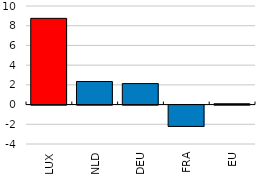
| Category | Series 0 |
|---|---|
| LUX | 8.747 |
| NLD | 2.341 |
| DEU | 2.128 |
| FRA | -2.166 |
| EU | 0.081 |